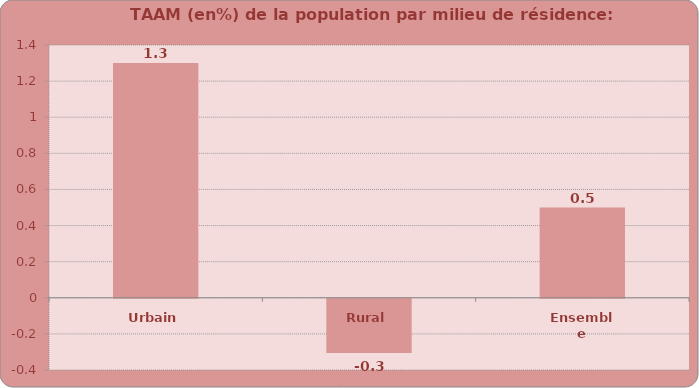
| Category | Series 0 |
|---|---|
| Urbain | 1.3 |
| Rural | -0.3 |
| Ensemble | 0.5 |